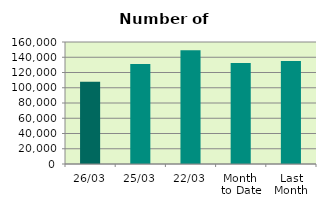
| Category | Series 0 |
|---|---|
| 26/03 | 108020 |
| 25/03 | 130992 |
| 22/03 | 149072 |
| Month 
to Date | 132581.778 |
| Last
Month | 135041.7 |